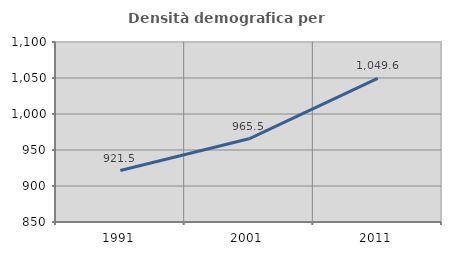
| Category | Densità demografica |
|---|---|
| 1991.0 | 921.476 |
| 2001.0 | 965.549 |
| 2011.0 | 1049.581 |